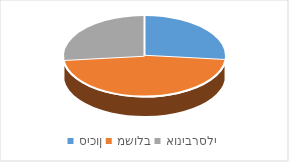
| Category | Series 0 |
|---|---|
| סיכון | 4 |
| משולב | 7 |
| אוניברסלי | 4 |